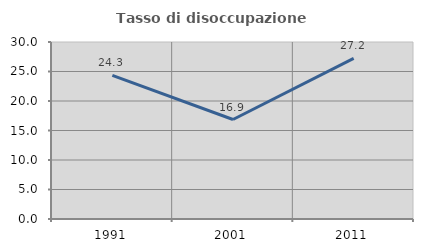
| Category | Tasso di disoccupazione giovanile  |
|---|---|
| 1991.0 | 24.333 |
| 2001.0 | 16.86 |
| 2011.0 | 27.211 |